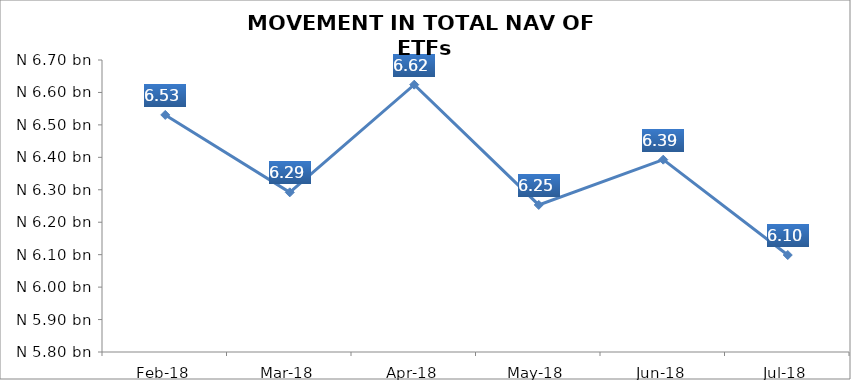
| Category | Series 0 |
|---|---|
| 2018-02-01 | 6530678114.87 |
| 2018-03-01 | 6292081212.23 |
| 2018-04-01 | 6623939625.39 |
| 2018-05-01 | 6253239764.9 |
| 2018-06-01 | 6392823777.55 |
| 2018-07-01 | 6098924594.48 |